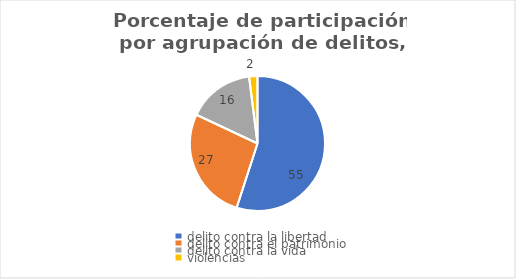
| Category | % |
|---|---|
| delito contra la libertad | 55 |
| delito contra el patrimonio | 27 |
| delito contra la vida | 16 |
| violencias | 2 |